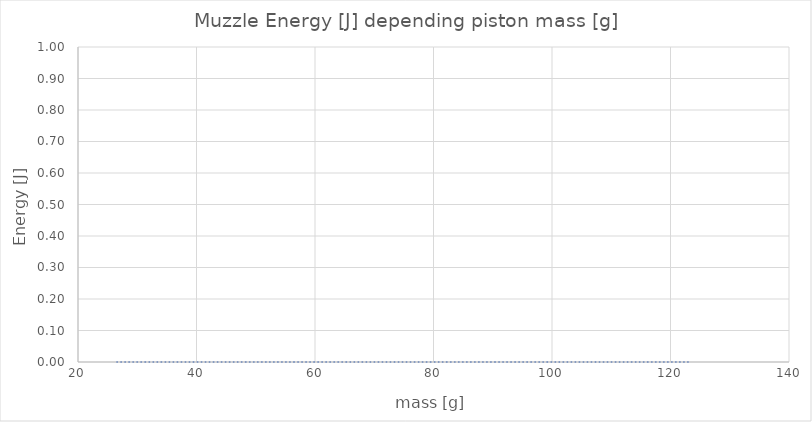
| Category | energy [J] |
|---|---|
| 26.6 | 0 |
| 34.8 | 0 |
| 43.0 | 0 |
| 50.8 | 0 |
| 51.199999999999996 | 0 |
| 59.0 | 0 |
| 59.4 | 0 |
| 67.19999999999999 | 0 |
| 75.0 | 0 |
| 75.4 | 0 |
| 83.19999999999999 | 0 |
| 91.39999999999999 | 0 |
| 99.19999999999999 | 0 |
| 107.39999999999999 | 0 |
| 123.39999999999999 | 0 |